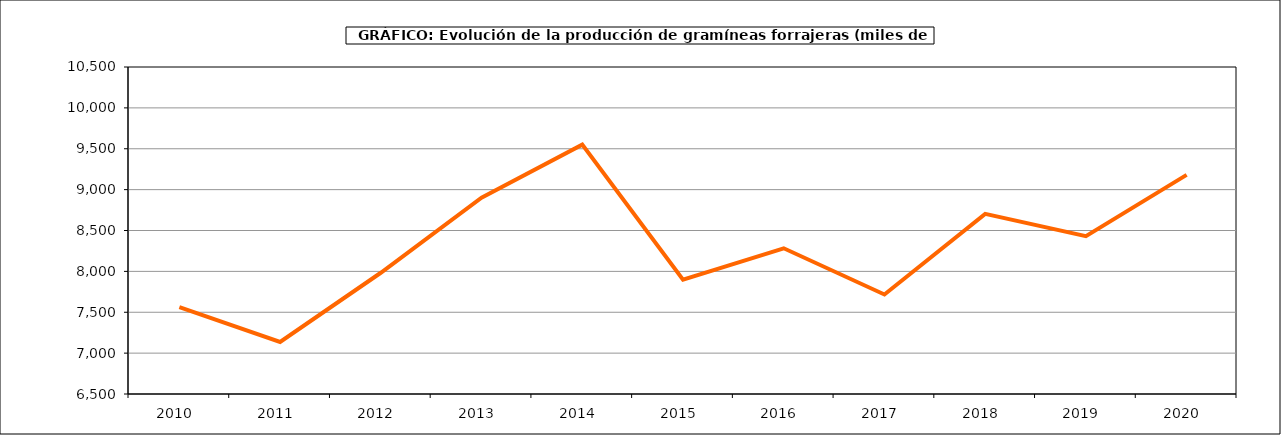
| Category | Superficie |
|---|---|
| 2010.0 | 7562.029 |
| 2011.0 | 7137.239 |
| 2012.0 | 7983.127 |
| 2013.0 | 8902.06 |
| 2014.0 | 9549.995 |
| 2015.0 | 7898.371 |
| 2016.0 | 8282.503 |
| 2017.0 | 7716.979 |
| 2018.0 | 8703.004 |
| 2019.0 | 8431.164 |
| 2020.0 | 9180.714 |